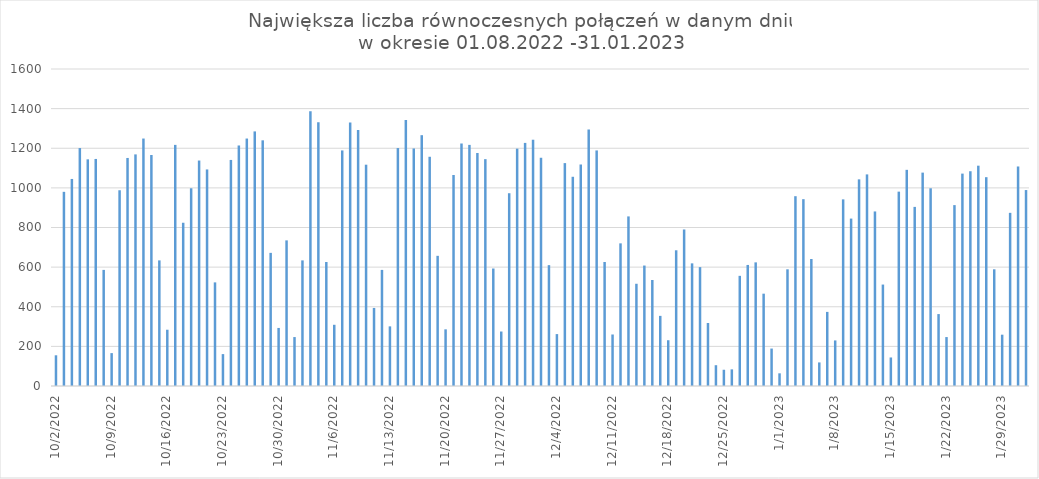
| Category | Max liczba połączeń |
|---|---|
| 10/2/22 | 155 |
| 10/3/22 | 980 |
| 10/4/22 | 1045 |
| 10/5/22 | 1201 |
| 10/6/22 | 1144 |
| 10/7/22 | 1146 |
| 10/8/22 | 586 |
| 10/9/22 | 166 |
| 10/10/22 | 988 |
| 10/11/22 | 1151 |
| 10/12/22 | 1169 |
| 10/13/22 | 1249 |
| 10/14/22 | 1166 |
| 10/15/22 | 634 |
| 10/16/22 | 284 |
| 10/17/22 | 1217 |
| 10/18/22 | 824 |
| 10/19/22 | 998 |
| 10/20/22 | 1138 |
| 10/21/22 | 1093 |
| 10/22/22 | 523 |
| 10/23/22 | 161 |
| 10/24/22 | 1141 |
| 10/25/22 | 1214 |
| 10/26/22 | 1249 |
| 10/27/22 | 1285 |
| 10/28/22 | 1240 |
| 10/29/22 | 672 |
| 10/30/22 | 293 |
| 10/31/22 | 735 |
| 11/1/22 | 247 |
| 11/2/22 | 634 |
| 11/3/22 | 1387 |
| 11/4/22 | 1331 |
| 11/5/22 | 626 |
| 11/6/22 | 309 |
| 11/7/22 | 1189 |
| 11/8/22 | 1330 |
| 11/9/22 | 1292 |
| 11/10/22 | 1117 |
| 11/11/22 | 394 |
| 11/12/22 | 586 |
| 11/13/22 | 301 |
| 11/14/22 | 1201 |
| 11/15/22 | 1342 |
| 11/16/22 | 1199 |
| 11/17/22 | 1266 |
| 11/18/22 | 1157 |
| 11/19/22 | 657 |
| 11/20/22 | 286 |
| 11/21/22 | 1065 |
| 11/22/22 | 1224 |
| 11/23/22 | 1217 |
| 11/24/22 | 1176 |
| 11/25/22 | 1145 |
| 11/26/22 | 593 |
| 11/27/22 | 275 |
| 11/28/22 | 973 |
| 11/29/22 | 1198 |
| 11/30/22 | 1227 |
| 12/1/22 | 1243 |
| 12/2/22 | 1152 |
| 12/3/22 | 610 |
| 12/4/22 | 262 |
| 12/5/22 | 1125 |
| 12/6/22 | 1056 |
| 12/7/22 | 1118 |
| 12/8/22 | 1295 |
| 12/9/22 | 1189 |
| 12/10/22 | 626 |
| 12/11/22 | 260 |
| 12/12/22 | 720 |
| 12/13/22 | 856 |
| 12/14/22 | 516 |
| 12/15/22 | 608 |
| 12/16/22 | 535 |
| 12/17/22 | 354 |
| 12/18/22 | 231 |
| 12/19/22 | 685 |
| 12/20/22 | 790 |
| 12/21/22 | 619 |
| 12/22/22 | 600 |
| 12/23/22 | 318 |
| 12/24/22 | 105 |
| 12/25/22 | 82 |
| 12/26/22 | 84 |
| 12/27/22 | 556 |
| 12/28/22 | 611 |
| 12/29/22 | 624 |
| 12/30/22 | 466 |
| 12/31/22 | 189 |
| 1/1/23 | 64 |
| 1/2/23 | 589 |
| 1/3/23 | 958 |
| 1/4/23 | 943 |
| 1/5/23 | 641 |
| 1/6/23 | 119 |
| 1/7/23 | 374 |
| 1/8/23 | 230 |
| 1/9/23 | 942 |
| 1/10/23 | 845 |
| 1/11/23 | 1043 |
| 1/12/23 | 1068 |
| 1/13/23 | 881 |
| 1/14/23 | 512 |
| 1/15/23 | 144 |
| 1/16/23 | 981 |
| 1/17/23 | 1091 |
| 1/18/23 | 904 |
| 1/19/23 | 1077 |
| 1/20/23 | 998 |
| 1/21/23 | 363 |
| 1/22/23 | 247 |
| 1/23/23 | 913 |
| 1/24/23 | 1072 |
| 1/25/23 | 1084 |
| 1/26/23 | 1112 |
| 1/27/23 | 1054 |
| 1/28/23 | 589 |
| 1/29/23 | 259 |
| 1/30/23 | 874 |
| 1/31/23 | 1108 |
| 2/1/23 | 989 |